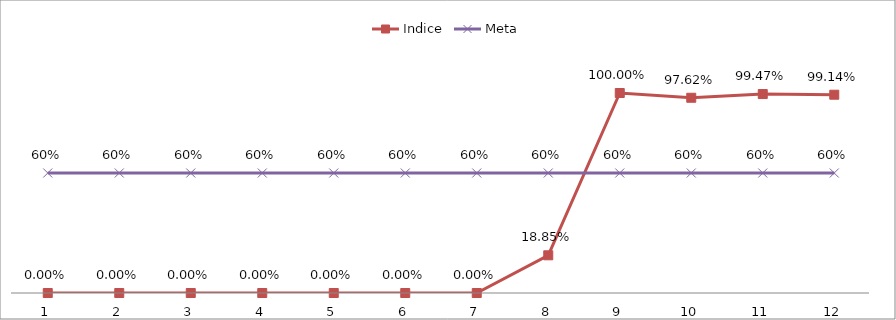
| Category | Indice | Meta |
|---|---|---|
| 0 | 0 | 0.6 |
| 1 | 0 | 0.6 |
| 2 | 0 | 0.6 |
| 3 | 0 | 0.6 |
| 4 | 0 | 0.6 |
| 5 | 0 | 0.6 |
| 6 | 0 | 0.6 |
| 7 | 0.188 | 0.6 |
| 8 | 1 | 0.6 |
| 9 | 0.976 | 0.6 |
| 10 | 0.995 | 0.6 |
| 11 | 0.991 | 0.6 |